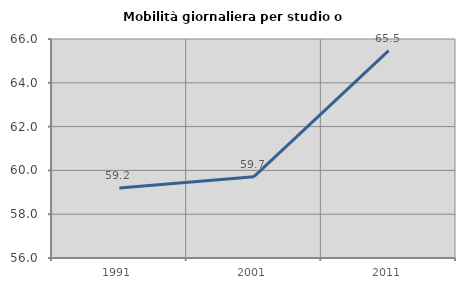
| Category | Mobilità giornaliera per studio o lavoro |
|---|---|
| 1991.0 | 59.193 |
| 2001.0 | 59.712 |
| 2011.0 | 65.472 |